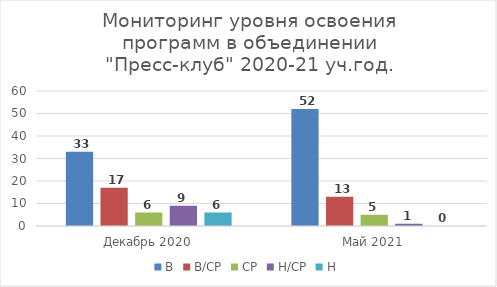
| Category | В | В/СР | СР | Н/СР | Н |
|---|---|---|---|---|---|
| Декабрь 2020 | 33 | 17 | 6 | 9 | 6 |
| Май 2021 | 52 | 13 | 5 | 1 | 0 |